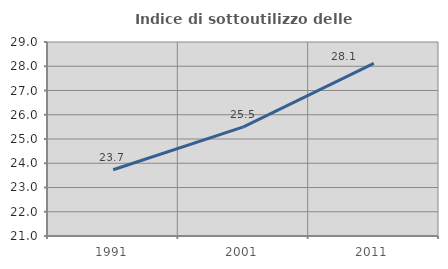
| Category | Indice di sottoutilizzo delle abitazioni  |
|---|---|
| 1991.0 | 23.733 |
| 2001.0 | 25.501 |
| 2011.0 | 28.121 |